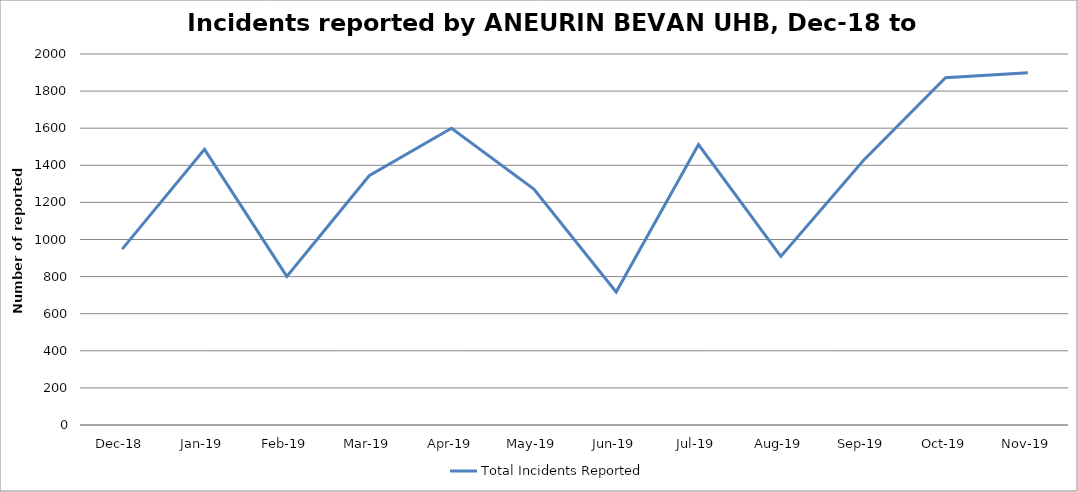
| Category | Total Incidents Reported |
|---|---|
| Dec-18 | 948 |
| Jan-19 | 1486 |
| Feb-19 | 801 |
| Mar-19 | 1344 |
| Apr-19 | 1600 |
| May-19 | 1272 |
| Jun-19 | 717 |
| Jul-19 | 1512 |
| Aug-19 | 909 |
| Sep-19 | 1425 |
| Oct-19 | 1872 |
| Nov-19 | 1899 |